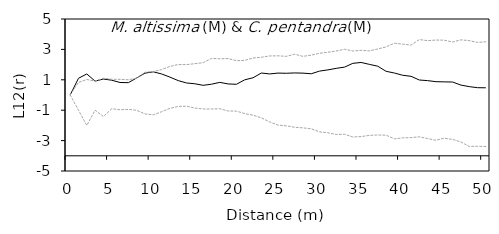
| Category | L12(r) | E12- | E12+ |
|---|---|---|---|
| 0.0 | 0 | 0 | 0 |
| 1.0 | 1.099 | -1 | 0.828 |
| 2.0 | 1.384 | -2 | 1.021 |
| 3.0 | 0.913 | -0.997 | 0.913 |
| 4.0 | 1.05 | -1.42 | 1.103 |
| 5.0 | 0.973 | -0.904 | 1.038 |
| 6.0 | 0.823 | -0.97 | 1.03 |
| 7.0 | 0.812 | -0.945 | 1.001 |
| 8.0 | 1.121 | -1.006 | 1.114 |
| 9.0 | 1.437 | -1.244 | 1.496 |
| 10.0 | 1.525 | -1.303 | 1.547 |
| 11.0 | 1.385 | -1.101 | 1.671 |
| 12.0 | 1.177 | -0.875 | 1.88 |
| 13.0 | 0.946 | -0.755 | 2.003 |
| 14.0 | 0.791 | -0.735 | 1.998 |
| 15.0 | 0.739 | -0.859 | 2.061 |
| 16.0 | 0.637 | -0.918 | 2.128 |
| 17.0 | 0.711 | -0.921 | 2.406 |
| 18.0 | 0.83 | -0.904 | 2.381 |
| 19.0 | 0.728 | -1.052 | 2.399 |
| 20.0 | 0.706 | -1.06 | 2.257 |
| 21.0 | 0.999 | -1.223 | 2.276 |
| 22.0 | 1.134 | -1.329 | 2.435 |
| 23.0 | 1.446 | -1.505 | 2.482 |
| 24.0 | 1.386 | -1.774 | 2.57 |
| 25.0 | 1.442 | -1.981 | 2.579 |
| 26.0 | 1.43 | -2.028 | 2.541 |
| 27.0 | 1.451 | -2.121 | 2.685 |
| 28.0 | 1.439 | -2.162 | 2.543 |
| 29.0 | 1.398 | -2.222 | 2.622 |
| 30.0 | 1.573 | -2.427 | 2.745 |
| 31.0 | 1.652 | -2.485 | 2.812 |
| 32.0 | 1.754 | -2.595 | 2.891 |
| 33.0 | 1.833 | -2.583 | 3.01 |
| 34.0 | 2.083 | -2.762 | 2.896 |
| 35.0 | 2.14 | -2.736 | 2.939 |
| 36.0 | 2.015 | -2.655 | 2.902 |
| 37.0 | 1.895 | -2.632 | 3.028 |
| 38.0 | 1.558 | -2.644 | 3.164 |
| 39.0 | 1.446 | -2.883 | 3.407 |
| 40.0 | 1.297 | -2.82 | 3.345 |
| 41.0 | 1.23 | -2.804 | 3.284 |
| 42.0 | 0.986 | -2.751 | 3.645 |
| 43.0 | 0.945 | -2.869 | 3.576 |
| 44.0 | 0.877 | -2.977 | 3.616 |
| 45.0 | 0.864 | -2.84 | 3.607 |
| 46.0 | 0.854 | -2.92 | 3.484 |
| 47.0 | 0.652 | -3.089 | 3.628 |
| 48.0 | 0.551 | -3.384 | 3.58 |
| 49.0 | 0.481 | -3.372 | 3.46 |
| 50.0 | 0.474 | -3.386 | 3.502 |